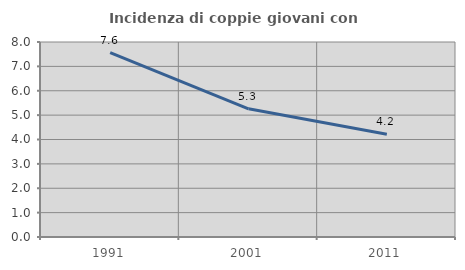
| Category | Incidenza di coppie giovani con figli |
|---|---|
| 1991.0 | 7.568 |
| 2001.0 | 5.26 |
| 2011.0 | 4.214 |